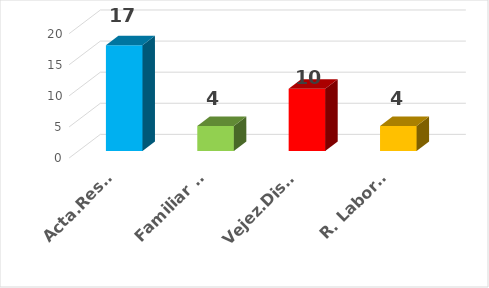
| Category | Series 0 |
|---|---|
| Acta.Res. Doc | 17 |
| Familiar de Salud | 4 |
| Vejez.Disc.Sobrev. | 10 |
| R. Laborales | 4 |